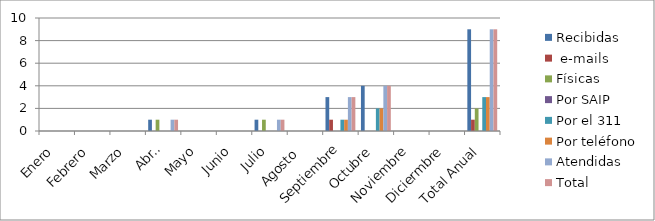
| Category | Recibidas |  e-mails | Físicas | Por SAIP | Por el 311 | Por teléfono | Atendidas | Total |
|---|---|---|---|---|---|---|---|---|
| Enero | 0 | 0 | 0 | 0 | 0 | 0 | 0 | 0 |
| Febrero | 0 | 0 | 0 | 0 | 0 | 0 | 0 | 0 |
| Marzo | 0 | 0 | 0 | 0 | 0 | 0 | 0 | 0 |
| Abril | 1 | 0 | 1 | 0 | 0 | 0 | 1 | 1 |
| Mayo | 0 | 0 | 0 | 0 | 0 | 0 | 0 | 0 |
| Junio | 0 | 0 | 0 | 0 | 0 | 0 | 0 | 0 |
| Julio | 1 | 0 | 1 | 0 | 0 | 0 | 1 | 1 |
| Agosto  | 0 | 0 | 0 | 0 | 0 | 0 | 0 | 0 |
| Septiembre | 3 | 1 | 0 | 0 | 1 | 1 | 3 | 3 |
| Octubre | 4 | 0 | 0 | 0 | 2 | 2 | 4 | 4 |
| Noviembre | 0 | 0 | 0 | 0 | 0 | 0 | 0 | 0 |
| Diciermbre | 0 | 0 | 0 | 0 | 0 | 0 | 0 | 0 |
| Total Anual | 9 | 1 | 2 | 0 | 3 | 3 | 9 | 9 |